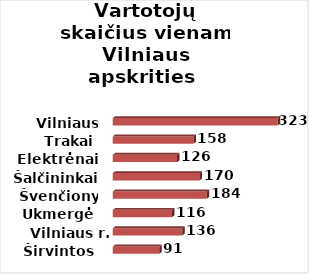
| Category | Series 0 |
|---|---|
| Širvintos | 91 |
| Vilniaus r. | 136 |
| Ukmergė | 116 |
| Švenčionys | 184 |
| Šalčininkai | 170 |
| Elektrėnai | 126 |
| Trakai | 158 |
| Vilniaus m. | 323 |